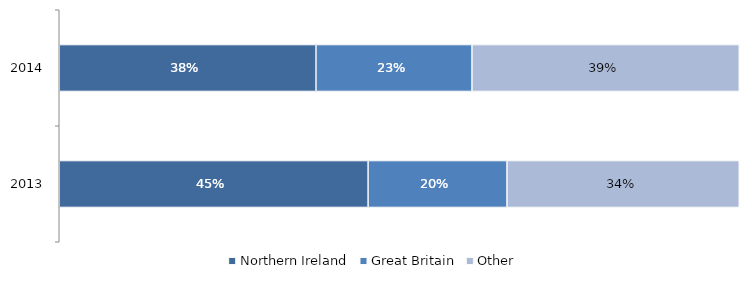
| Category | Northern Ireland | Great Britain | Other |
|---|---|---|---|
| 2013.0 | 0.454 | 0.204 | 0.342 |
| 2014.0 | 0.378 | 0.229 | 0.393 |